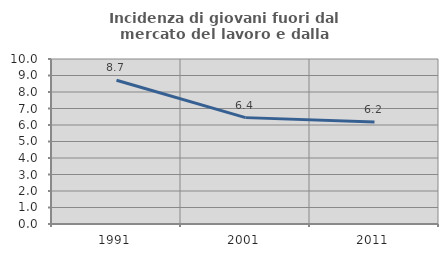
| Category | Incidenza di giovani fuori dal mercato del lavoro e dalla formazione  |
|---|---|
| 1991.0 | 8.714 |
| 2001.0 | 6.447 |
| 2011.0 | 6.189 |